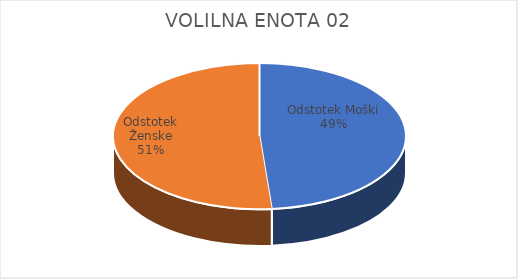
| Category | VOLILNA ENOTA 02 | #REF! | Slovenija skupaj |
|---|---|---|---|
| Odstotek Moški | 23.72 |  | 25.26 |
| Odstotek Ženske | 25.02 |  | 26.62 |